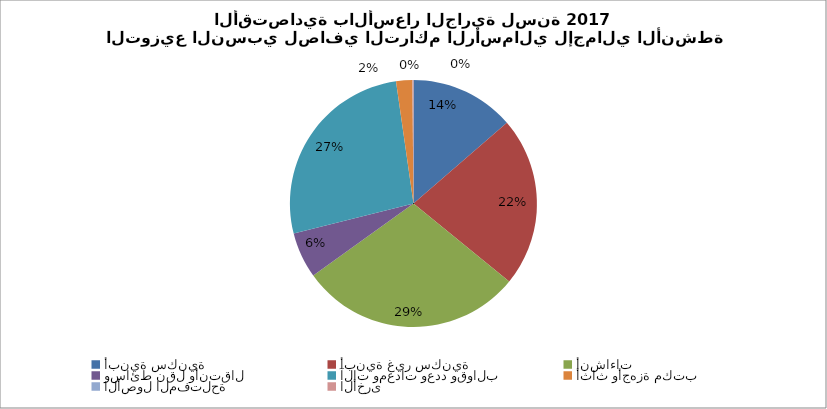
| Category | Series 0 |
|---|---|
| أبنية سكنية | 33306059.885 |
| أبنية غير سكنية | 54325883.641 |
| أنشاءات | 71260064.193 |
| وسائط نقل وأنتقال | 14692380.299 |
| آلات ومعدات وعدد وقوالب | 65048298.615 |
| أثاث وأجهزة مكتب | 5172277.561 |
| الأصول المفتلحة | 41110.145 |
| الأخرى  | 317221.645 |